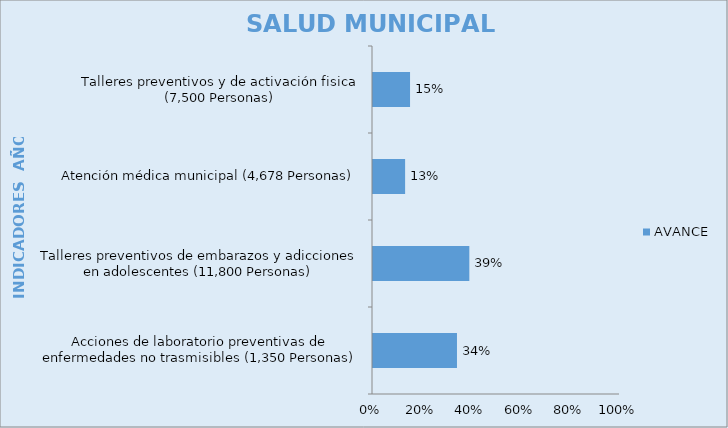
| Category | AVANCE |
|---|---|
| Acciones de laboratorio preventivas de enfermedades no trasmisibles (1,350 Personas) | 0.34 |
| Talleres preventivos de embarazos y adicciones en adolescentes (11,800 Personas) | 0.39 |
| Atención médica municipal (4,678 Personas) | 0.13 |
| Talleres preventivos y de activación fisica (7,500 Personas) | 0.15 |